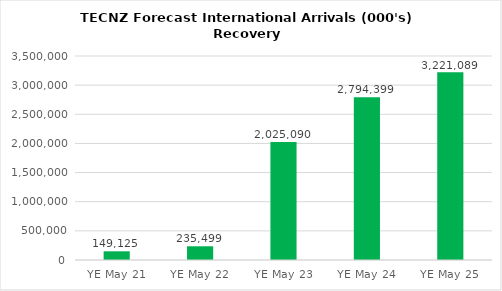
| Category | No. Visitors |
|---|---|
| YE May 21 | 149125 |
| YE May 22 | 235499.3 |
| YE May 23 | 2025090.35 |
| YE May 24 | 2794399.3 |
| YE May 25 | 3221089.4 |